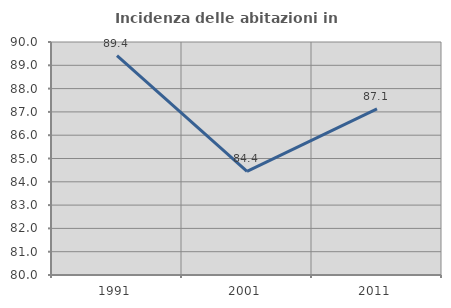
| Category | Incidenza delle abitazioni in proprietà  |
|---|---|
| 1991.0 | 89.416 |
| 2001.0 | 84.444 |
| 2011.0 | 87.129 |